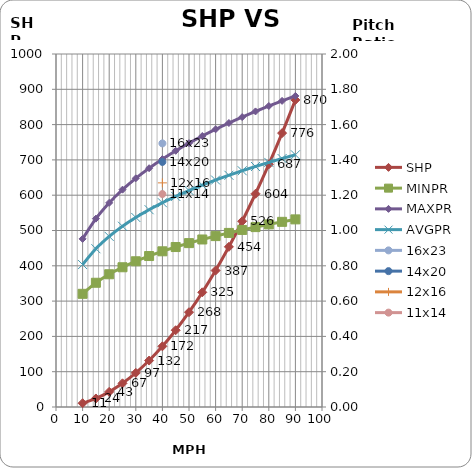
| Category | SHP |
|---|---|
| 10.0 | 10.739 |
| 15.0 | 24.164 |
| 20.0 | 42.958 |
| 25.0 | 67.122 |
| 30.0 | 96.655 |
| 35.0 | 131.559 |
| 40.0 | 171.832 |
| 45.0 | 217.474 |
| 50.0 | 268.487 |
| 55.0 | 324.869 |
| 60.0 | 386.621 |
| 65.0 | 453.743 |
| 70.0 | 526.235 |
| 75.0 | 604.096 |
| 80.0 | 687.327 |
| 85.0 | 775.927 |
| 90.0 | 869.898 |